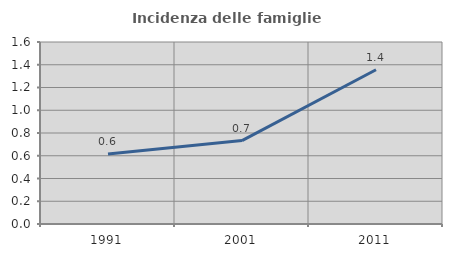
| Category | Incidenza delle famiglie numerose |
|---|---|
| 1991.0 | 0.616 |
| 2001.0 | 0.733 |
| 2011.0 | 1.356 |